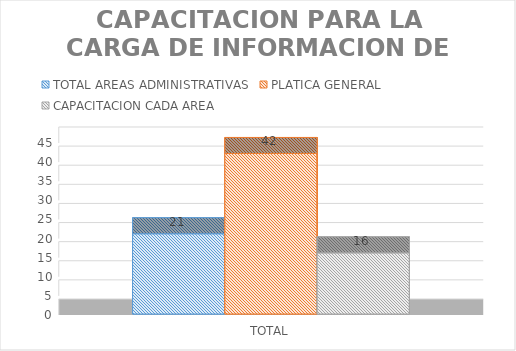
| Category | TOTAL AREAS ADMINISTRATIVAS | PLATICA GENERAL | CAPACITACION CADA AREA |
|---|---|---|---|
| TOTAL | 21 | 42 | 16 |